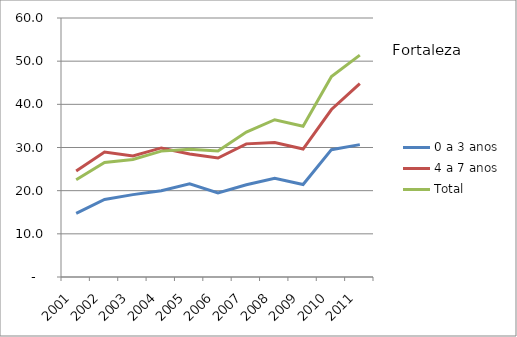
| Category | 0 a 3 anos | 4 a 7 anos | Total |
|---|---|---|---|
| 2001.0 | 14.73 | 24.53 | 22.53 |
| 2002.0 | 17.95 | 28.97 | 26.52 |
| 2003.0 | 19.08 | 28.04 | 27.22 |
| 2004.0 | 19.99 | 29.9 | 29.16 |
| 2005.0 | 21.59 | 28.48 | 29.62 |
| 2006.0 | 19.5 | 27.56 | 29.18 |
| 2007.0 | 21.36 | 30.84 | 33.57 |
| 2008.0 | 22.89 | 31.13 | 36.43 |
| 2009.0 | 21.43 | 29.64 | 34.94 |
| 2010.0 | 29.5 | 38.8 | 46.44 |
| 2011.0 | 30.67 | 44.79 | 51.4 |